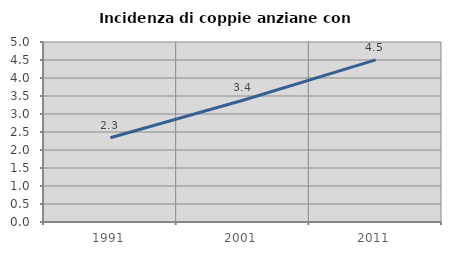
| Category | Incidenza di coppie anziane con figli |
|---|---|
| 1991.0 | 2.339 |
| 2001.0 | 3.381 |
| 2011.0 | 4.503 |